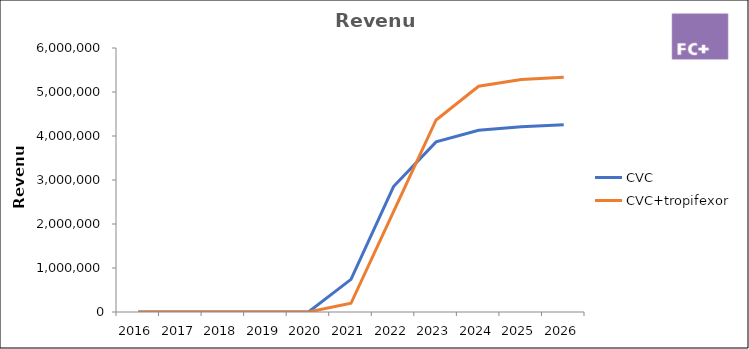
| Category | CVC | CVC+tropifexor |
|---|---|---|
| 2016.0 | 0 | 0 |
| 2017.0 | 0 | 0 |
| 2018.0 | 0 | 0 |
| 2019.0 | 0 | 0 |
| 2020.0 | 0 | 0 |
| 2021.0 | 742263.033 | 197912.945 |
| 2022.0 | 2850320.972 | 2281091.813 |
| 2023.0 | 3866224.408 | 4364309.943 |
| 2024.0 | 4128631.683 | 5131337.053 |
| 2025.0 | 4212043.805 | 5284111.973 |
| 2026.0 | 4254164.243 | 5336953.093 |